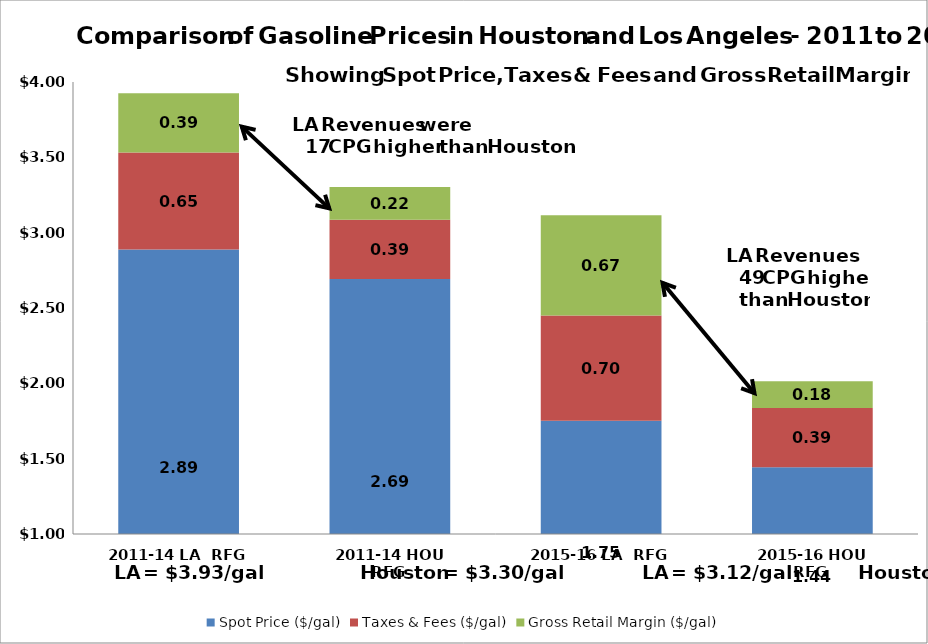
| Category | Spot Price ($/gal) | Taxes & Fees ($/gal) | Gross Retail Margin ($/gal) |
|---|---|---|---|
|  2011-14 LA  RFG  | 2.887 | 0.645 | 0.392 |
|  2011-14 HOU  RFG  | 2.692 | 0.394 | 0.216 |
|  2015-16 LA  RFG  | 1.751 | 0.699 | 0.665 |
|  2015-16 HOU  RFG  | 1.442 | 0.394 | 0.178 |